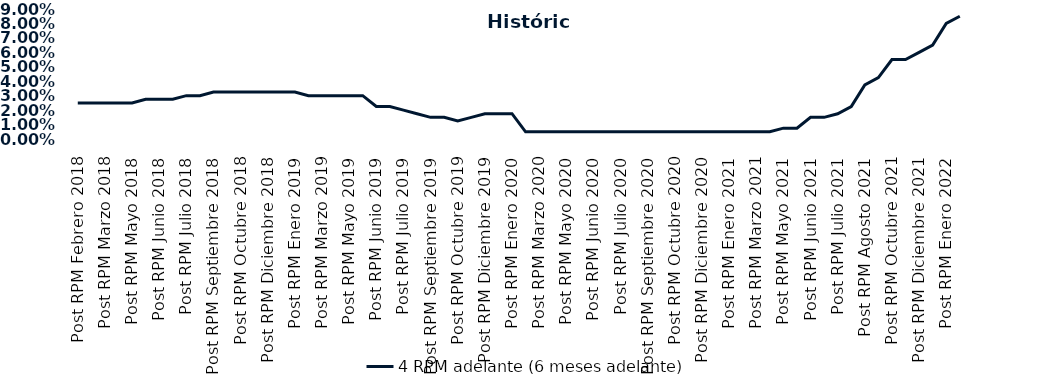
| Category | 4 RPM adelante (6 meses adelante) |
|---|---|
| Post RPM Febrero 2018 | 0.025 |
| Pre RPM Marzo 2018 | 0.025 |
| Post RPM Marzo 2018 | 0.025 |
| Pre RPM Mayo 2018 | 0.025 |
| Post RPM Mayo 2018 | 0.025 |
| Pre RPM Junio 2018 | 0.028 |
| Post RPM Junio 2018 | 0.028 |
| Pre RPM Julio 2018 | 0.028 |
| Post RPM Julio 2018 | 0.03 |
| Pre RPM Septiembre 2018 | 0.03 |
| Post RPM Septiembre 2018 | 0.032 |
| Pre RPM Octubre 2018 | 0.032 |
| Post RPM Octubre 2018 | 0.032 |
| Pre RPM Diciembre 2018 | 0.032 |
| Post RPM Diciembre 2018 | 0.032 |
| Pre RPM Enero 2019 | 0.032 |
| Post RPM Enero 2019 | 0.032 |
| Pre RPM Marzo 2019 | 0.03 |
| Post RPM Marzo 2019 | 0.03 |
| Pre RPM Mayo 2019 | 0.03 |
| Post RPM Mayo 2019 | 0.03 |
| Pre RPM Junio 2019 | 0.03 |
| Post RPM Junio 2019 | 0.022 |
| Pre RPM Julio 2019 | 0.022 |
| Post RPM Julio 2019 | 0.02 |
| Pre RPM Septiembre 2019 | 0.018 |
| Post RPM Septiembre 2019 | 0.015 |
| Pre RPM Octubre 2019 | 0.015 |
| Post RPM Octubre 2019 | 0.012 |
| Pre RPM Diciembre 2019 | 0.015 |
| Post RPM Diciembre 2019 | 0.018 |
| Pre RPM Enero 2020 | 0.018 |
| Post RPM Enero 2020 | 0.018 |
| Pre RPM Marzo 2020 | 0.005 |
| Post RPM Marzo 2020 | 0.005 |
| Pre RPM Mayo 2020 | 0.005 |
| Post RPM Mayo 2020 | 0.005 |
| Pre RPM Junio 2020 | 0.005 |
| Post RPM Junio 2020 | 0.005 |
| Pre RPM Julio 2020 | 0.005 |
| Post RPM Julio 2020 | 0.005 |
| Pre RPM Septiembre 2020 | 0.005 |
| Post RPM Septiembre 2020 | 0.005 |
| Pre RPM Octubre 2020 | 0.005 |
| Post RPM Octubre 2020 | 0.005 |
| Pre RPM Diciembre 2020 | 0.005 |
| Post RPM Diciembre 2020 | 0.005 |
| Pre RPM Enero 2021 | 0.005 |
| Post RPM Enero 2021 | 0.005 |
| Pre RPM Marzo 2021 | 0.005 |
| Post RPM Marzo 2021 | 0.005 |
| Pre RPM Mayo 2021 | 0.005 |
| Post RPM Mayo 2021 | 0.008 |
| Pre RPM Junio 2021 | 0.008 |
| Post RPM Junio 2021 | 0.015 |
| Pre RPM Julio 2021 | 0.015 |
| Post RPM Julio 2021 | 0.018 |
| Pre RPM Agosto 2021 | 0.022 |
| Post RPM Agosto 2021 | 0.038 |
| Pre RPM Octubre 2021 | 0.042 |
| Post RPM Octubre 2021 | 0.055 |
| Pre RPM Diciembre 2021 | 0.055 |
| Post RPM Diciembre 2021 | 0.06 |
| Pre RPM Enero 2022 | 0.065 |
| Post RPM Enero 2022 | 0.08 |
| Pre RPM Marzo 2022 | 0.085 |